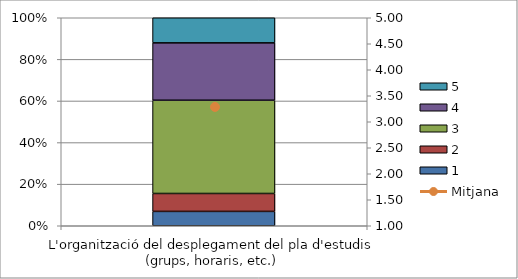
| Category | 1 | 2 | 3 | 4 | 5 |
|---|---|---|---|---|---|
| L'organització del desplegament del pla d'estudis (grups, horaris, etc.) | 4 | 5 | 26 | 16 | 7 |